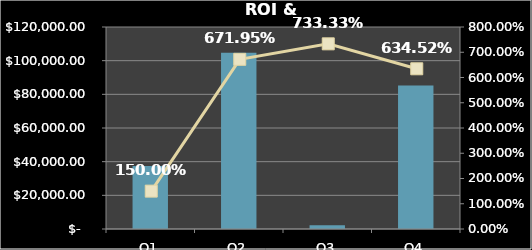
| Category | Series 0 |
|---|---|
| Q1 | 37500 |
| Q2 | 104716 |
| Q3 | 2200 |
| Q4 | 85223 |